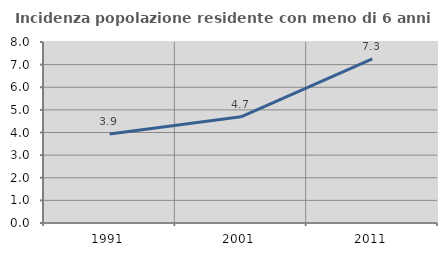
| Category | Incidenza popolazione residente con meno di 6 anni |
|---|---|
| 1991.0 | 3.937 |
| 2001.0 | 4.695 |
| 2011.0 | 7.254 |